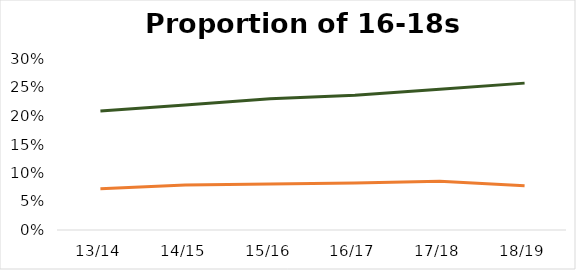
| Category | BAME % |
|---|---|
| 13/14 | 0.072 |
| 14/15 | 0.079 |
| 15/16 | 0.081 |
| 16/17 | 0.083 |
| 17/18 | 0.086 |
| 18/19 | 0.078 |